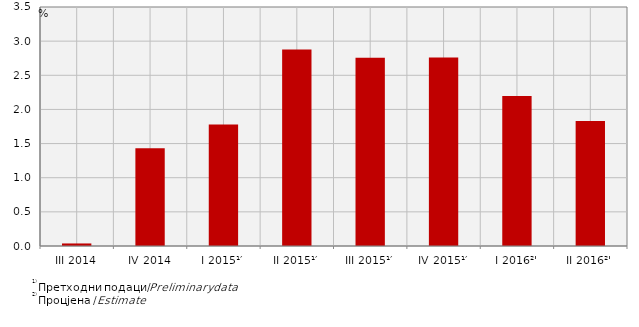
| Category | Стопе реалног раста БДП-а
Real growth rates of GDP |
|---|---|
| III 2014 | 0.037 |
| IV 2014 | 1.432 |
| I 2015¹′ | 1.779 |
| II 2015¹′ | 2.878 |
| III 2015¹′ | 2.756 |
| IV 2015¹′ | 2.76 |
| I 2016²' | 2.198 |
| II 2016²' | 1.831 |